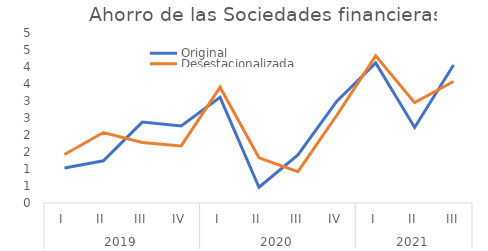
| Category | Original | Desestacionalizada |
|---|---|---|
| 0 | 1.031 | 1.427 |
| 1 | 1.242 | 2.074 |
| 2 | 2.381 | 1.78 |
| 3 | 2.264 | 1.68 |
| 4 | 3.107 | 3.407 |
| 5 | 0.464 | 1.328 |
| 6 | 1.414 | 0.923 |
| 7 | 2.994 | 2.581 |
| 8 | 4.121 | 4.329 |
| 9 | 2.223 | 2.951 |
| 10 | 4.059 | 3.574 |